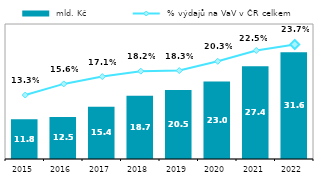
| Category |  mld. Kč |
|---|---|
| 2015.0 | 11.763 |
| 2016.0 | 12.477 |
| 2017.0 | 15.448 |
| 2018.0 | 18.72 |
| 2019.0 | 20.474 |
| 2020.0 | 22.975 |
| 2021.0 | 27.45 |
| 2022.0 | 31.643 |